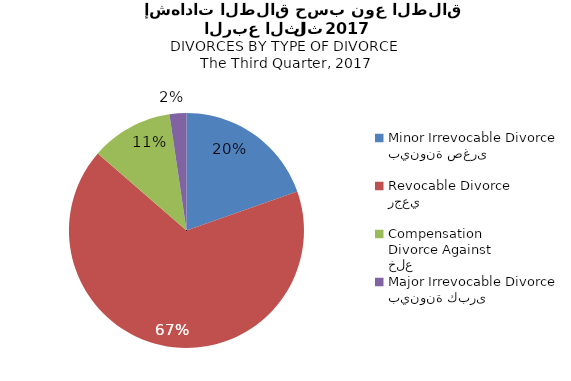
| Category | Series 1 |
|---|---|
| بينونة صغرى
Minor Irrevocable Divorce  | 59 |
| رجعي
Revocable Divorce  | 201 |
| خلع
Divorce Against Compensation | 34 |
| بينونة كبرى
Major Irrevocable Divorce  | 7 |